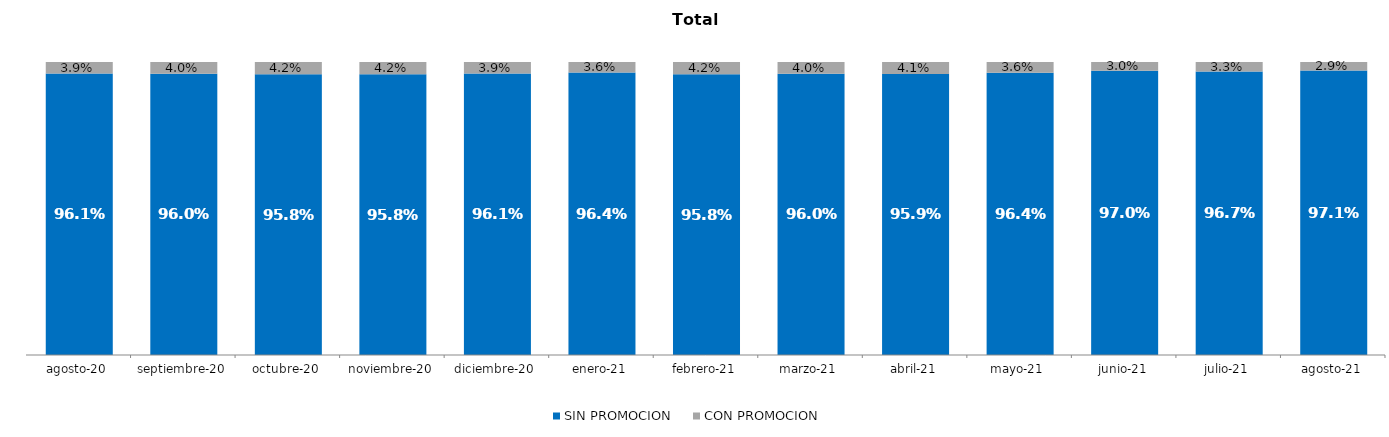
| Category | SIN PROMOCION   | CON PROMOCION   |
|---|---|---|
| 2020-08-01 | 0.961 | 0.039 |
| 2020-09-01 | 0.96 | 0.04 |
| 2020-10-01 | 0.958 | 0.042 |
| 2020-11-01 | 0.958 | 0.042 |
| 2020-12-01 | 0.961 | 0.039 |
| 2021-01-01 | 0.964 | 0.036 |
| 2021-02-01 | 0.958 | 0.042 |
| 2021-03-01 | 0.96 | 0.04 |
| 2021-04-01 | 0.959 | 0.041 |
| 2021-05-01 | 0.964 | 0.036 |
| 2021-06-01 | 0.97 | 0.03 |
| 2021-07-01 | 0.967 | 0.033 |
| 2021-08-01 | 0.971 | 0.029 |